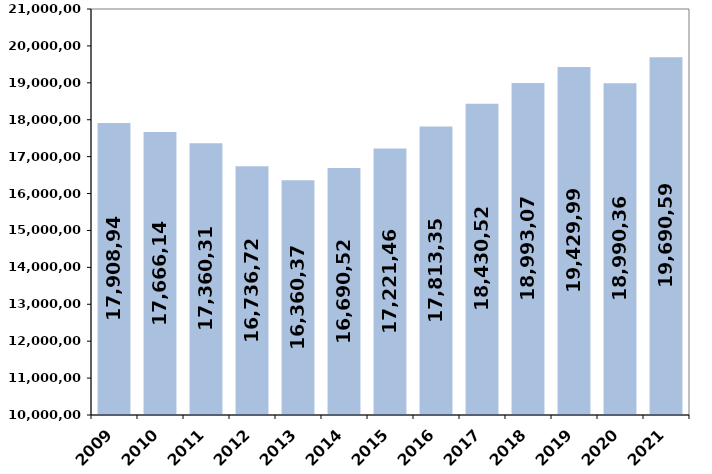
| Category | % de variación
 interanual |
|---|---|
| 2009 | 17908945.38 |
| 2010 | 17666149.05 |
| 2011 | 17360312.55 |
| 2012 | 16736726.63 |
| 2013 | 16360372.52 |
| 2014 | 16690519.73 |
| 2015 | 17221466.52 |
| 2016 | 17813355.9 |
| 2017 | 18430529.03 |
| 2018 | 18993072.81 |
| 2019 | 19429993 |
| 2020 | 18990364 |
| 2021 | 19690589.65 |